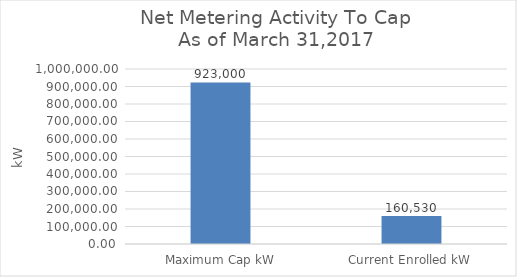
| Category | Series 0 |
|---|---|
| Maximum Cap kW | 923000 |
| Current Enrolled kW | 160530.1 |